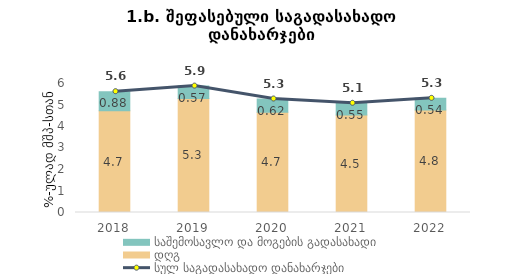
| Category | დღგ | საშემოსავლო და მოგების გადასახადი |
|---|---|---|
| 2018.0 | 4.737 | 0.881 |
| 2019.0 | 5.305 | 0.574 |
| 2020.0 | 4.663 | 0.616 |
| 2021.0 | 4.532 | 0.548 |
| 2022.0 | 4.772 | 0.537 |